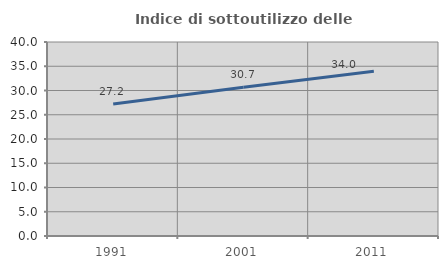
| Category | Indice di sottoutilizzo delle abitazioni  |
|---|---|
| 1991.0 | 27.219 |
| 2001.0 | 30.688 |
| 2011.0 | 33.989 |